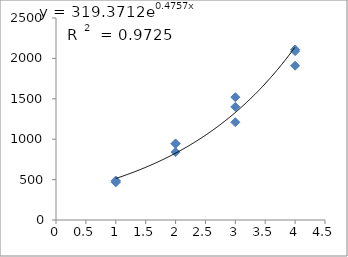
| Category | Series 0 |
|---|---|
| 1.0 | 480 |
| 1.0 | 466 |
| 1.0 | 488 |
| 2.0 | 945 |
| 2.0 | 945 |
| 2.0 | 840 |
| 3.0 | 1210 |
| 3.0 | 1400 |
| 3.0 | 1520 |
| 4.0 | 2090 |
| 4.0 | 1910 |
| 4.0 | 2110 |